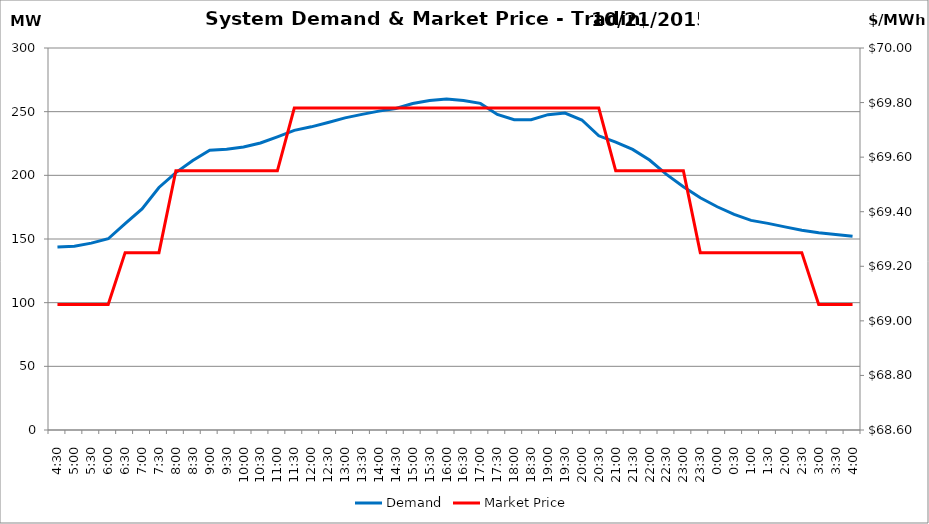
| Category | Demand |
|---|---|
| 0.1875 | 143.78 |
| 0.20833333333333334 | 144.33 |
| 0.22916666666666666 | 146.78 |
| 0.25 | 150.2 |
| 0.270833333333333 | 162.03 |
| 0.291666666666667 | 173.66 |
| 0.3125 | 190.48 |
| 0.333333333333333 | 202.13 |
| 0.354166666666667 | 211.65 |
| 0.375 | 219.64 |
| 0.395833333333333 | 220.45 |
| 0.416666666666667 | 222.19 |
| 0.4375 | 225.38 |
| 0.458333333333333 | 230.24 |
| 0.479166666666667 | 235.3 |
| 0.5 | 238.09 |
| 0.520833333333333 | 241.54 |
| 0.541666666666667 | 245.12 |
| 0.5625 | 247.89 |
| 0.583333333333333 | 250.44 |
| 0.604166666666667 | 252.5 |
| 0.625 | 256.4 |
| 0.645833333333334 | 258.82 |
| 0.666666666666667 | 260.03 |
| 0.6875 | 258.82 |
| 0.708333333333334 | 256.51 |
| 0.729166666666667 | 247.82 |
| 0.75 | 243.69 |
| 0.770833333333334 | 243.72 |
| 0.791666666666667 | 247.63 |
| 0.8125 | 248.88 |
| 0.833333333333334 | 243.46 |
| 0.854166666666667 | 231.06 |
| 0.875 | 226.11 |
| 0.895833333333334 | 220.34 |
| 0.916666666666667 | 211.99 |
| 0.9375 | 200.75 |
| 0.958333333333334 | 191.08 |
| 0.979166666666667 | 182.34 |
| 1900-01-01 | 175.33 |
| 1900-01-01 00:30:00 | 169.32 |
| 1900-01-01 01:00:00 | 164.61 |
| 1900-01-01 01:30:00 | 162.28 |
| 1900-01-01 02:00:00 | 159.51 |
| 1900-01-01 02:30:00 | 156.87 |
| 1900-01-01 03:00:00 | 154.94 |
| 1900-01-01 03:30:00 | 153.62 |
| 1900-01-01 04:00:00 | 152.24 |